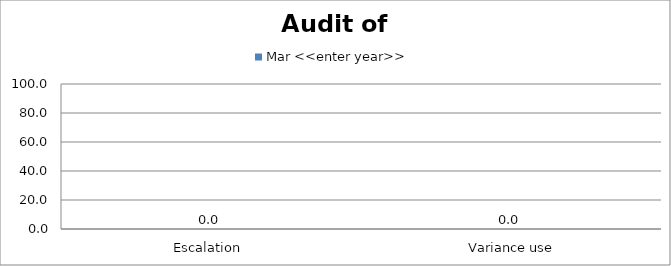
| Category | Mar <<enter year>> |
|---|---|
| Escalation  | 0 |
|  Variance use | 0 |